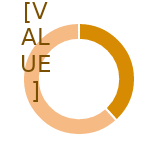
| Category | Series 0 |
|---|---|
| 0 | 0.383 |
| 1 | 0.617 |